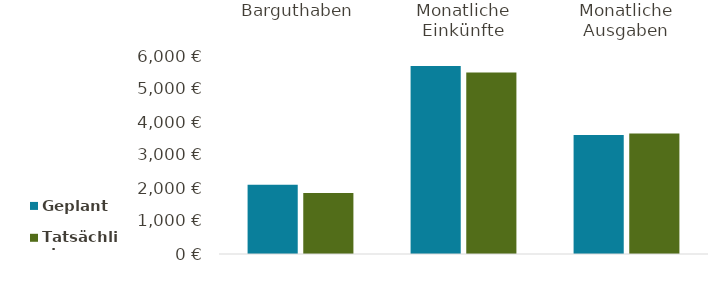
| Category | Geplant | Tatsächlich |
|---|---|---|
| Barguthaben | 2097 | 1845 |
| Monatliche Einkünfte | 5700 | 5500 |
| Monatliche Ausgaben | 3603 | 3655 |